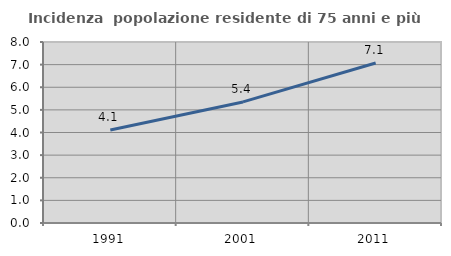
| Category | Incidenza  popolazione residente di 75 anni e più |
|---|---|
| 1991.0 | 4.114 |
| 2001.0 | 5.351 |
| 2011.0 | 7.069 |